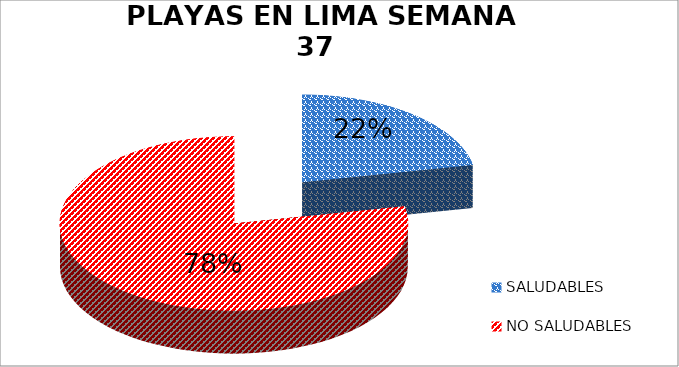
| Category | N.° |
|---|---|
| SALUDABLES | 12 |
| NO SALUDABLES | 43 |